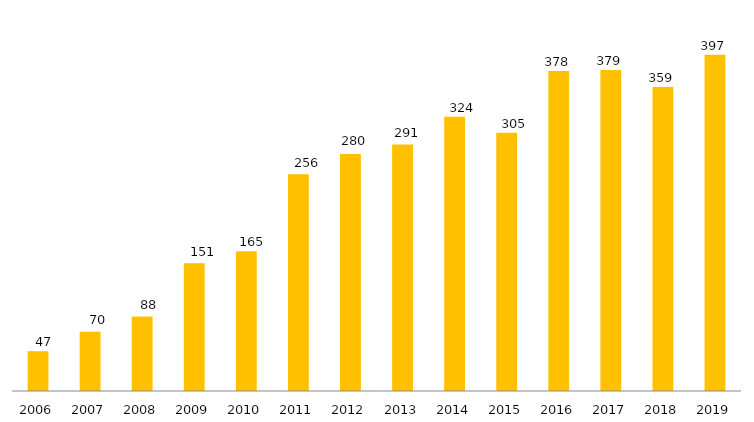
| Category | Programa |
|---|---|
| 2006.0 | 47 |
| 2007.0 | 70 |
| 2008.0 | 88 |
| 2009.0 | 151 |
| 2010.0 | 165 |
| 2011.0 | 256 |
| 2012.0 | 280 |
| 2013.0 | 291 |
| 2014.0 | 324 |
| 2015.0 | 305 |
| 2016.0 | 378 |
| 2017.0 | 379 |
| 2018.0 | 359 |
| 2019.0 | 397 |